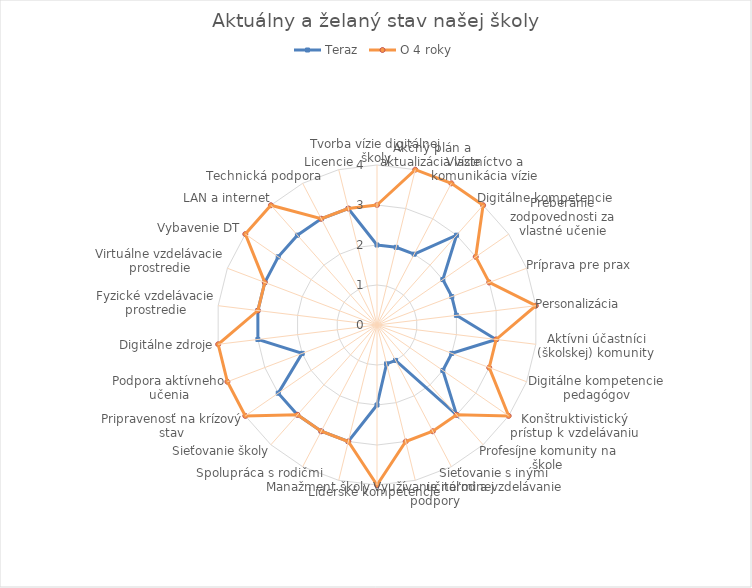
| Category | Teraz | O 4 roky |
|---|---|---|
| Tvorba vízie digitálnej školy | 2 | 3 |
| Akčný plán a aktualizácia vízie | 2 | 4 |
| Vlastníctvo a komunikácia vízie | 2 | 4 |
| Digitálne kompetencie | 3 | 4 |
| Preberanie zodpovednosti za vlastné učenie | 2 | 3 |
| Príprava pre prax | 2 | 3 |
| Personalizácia | 2 | 4 |
| Aktívni účastníci (školskej) komunity | 3 | 3 |
| Digitálne kompetencie pedagógov | 2 | 3 |
| Konštruktivistický prístup k vzdelávaniu | 2 | 4 |
| Profesíjne komunity na škole | 3 | 3 |
| Sieťovanie s inými učiteľmi a vzdelávanie | 1 | 3 |
| Využívanie národnej podpory | 1 | 3 |
| Líderské kompetencie | 2 | 4 |
| Manažment školy | 3 | 3 |
| Spolupráca s rodičmi | 3 | 3 |
| Sieťovanie školy | 3 | 3 |
| Pripravenosť na krízový stav | 3 | 4 |
| Podpora aktívneho učenia | 2 | 4 |
| Digitálne zdroje | 3 | 4 |
| Fyzické vzdelávacie prostredie | 3 | 3 |
| Virtuálne vzdelávacie prostredie | 3 | 3 |
| Vybavenie DT | 3 | 4 |
| LAN a internet | 3 | 4 |
| Technická podpora | 3 | 3 |
| Licencie | 3 | 3 |